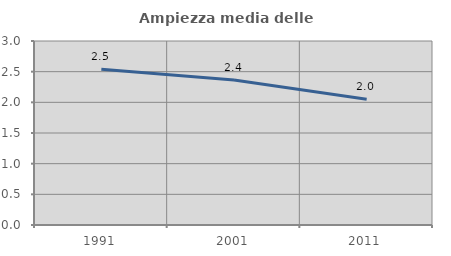
| Category | Ampiezza media delle famiglie |
|---|---|
| 1991.0 | 2.538 |
| 2001.0 | 2.363 |
| 2011.0 | 2.049 |